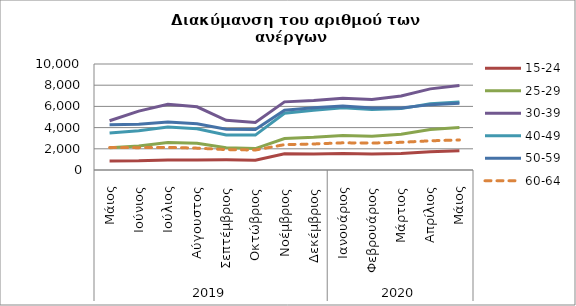
| Category | 15-24 | 25-29 | 30-39 | 40-49 | 50-59 | 60-64 |
|---|---|---|---|---|---|---|
| 0 | 855 | 2089 | 4649 | 3486 | 4277 | 2115 |
| 1 | 865 | 2260 | 5554 | 3710 | 4325 | 2110 |
| 2 | 937 | 2588 | 6199 | 4067 | 4524 | 2132 |
| 3 | 950 | 2528 | 5962 | 3895 | 4356 | 2062 |
| 4 | 960 | 2109 | 4687 | 3310 | 3846 | 1924 |
| 5 | 919 | 2022 | 4478 | 3293 | 3811 | 1886 |
| 6 | 1537 | 2970 | 6427 | 5355 | 5640 | 2393 |
| 7 | 1503 | 3082 | 6550 | 5646 | 5873 | 2456 |
| 8 | 1553 | 3257 | 6759 | 5874 | 6042 | 2564 |
| 9 | 1509 | 3191 | 6656 | 5700 | 5841 | 2544 |
| 10 | 1555 | 3375 | 6990 | 5790 | 5839 | 2611 |
| 11 | 1729 | 3820 | 7653 | 6252 | 6167 | 2755 |
| 12 | 1820 | 4016 | 7970 | 6420 | 6304 | 2833 |